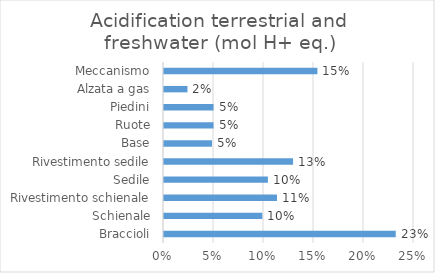
| Category | Acidification terrestrial and freshwater (mol H+ eq.) |
|---|---|
| Braccioli | 0.232 |
| Schienale | 0.098 |
| Rivestimento schienale | 0.113 |
| Sedile | 0.104 |
| Rivestimento sedile | 0.129 |
| Base | 0.048 |
| Ruote | 0.05 |
| Piedini | 0.05 |
| Alzata a gas | 0.023 |
| Meccanismo | 0.153 |